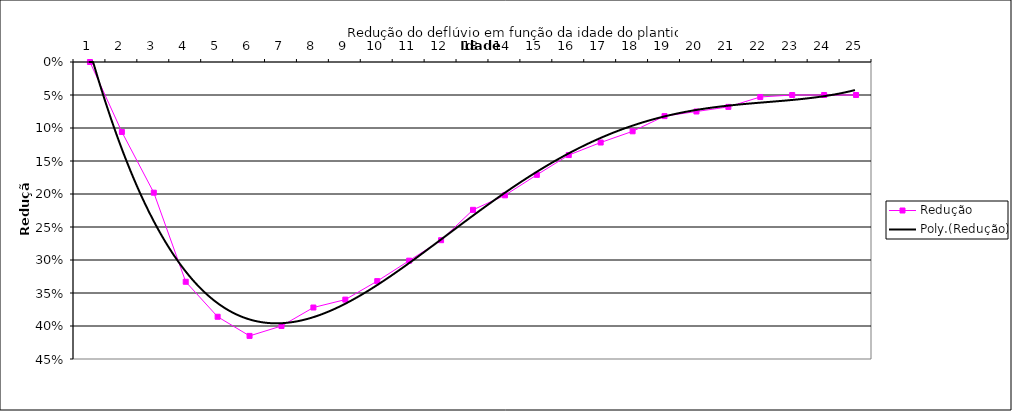
| Category | Redução |
|---|---|
| 0 | 0 |
| 1 | 0.106 |
| 2 | 0.198 |
| 3 | 0.333 |
| 4 | 0.386 |
| 5 | 0.415 |
| 6 | 0.4 |
| 7 | 0.372 |
| 8 | 0.36 |
| 9 | 0.332 |
| 10 | 0.301 |
| 11 | 0.27 |
| 12 | 0.224 |
| 13 | 0.202 |
| 14 | 0.171 |
| 15 | 0.141 |
| 16 | 0.122 |
| 17 | 0.105 |
| 18 | 0.082 |
| 19 | 0.075 |
| 20 | 0.068 |
| 21 | 0.053 |
| 22 | 0.05 |
| 23 | 0.05 |
| 24 | 0.05 |